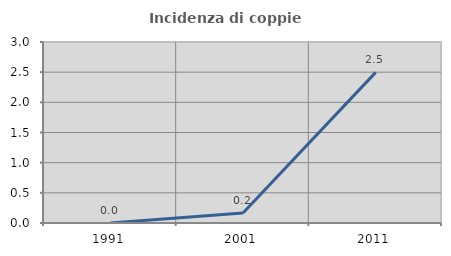
| Category | Incidenza di coppie miste |
|---|---|
| 1991.0 | 0 |
| 2001.0 | 0.166 |
| 2011.0 | 2.496 |